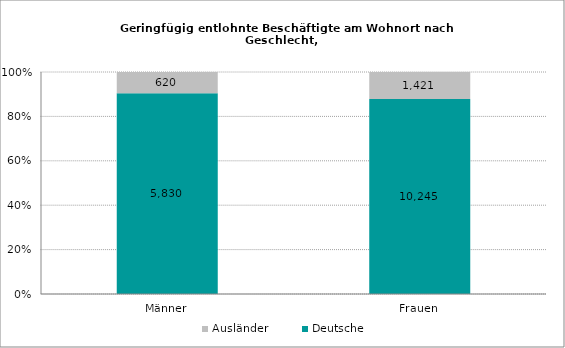
| Category | Deutsche | Ausländer |
|---|---|---|
| Männer | 5830 | 620 |
| Frauen | 10245 | 1421 |